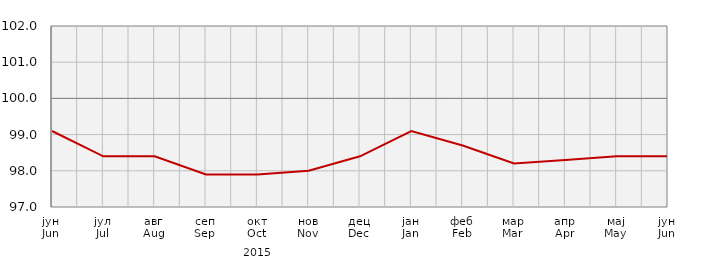
| Category | Индекси потрошачких цијена
Consumer price indices |
|---|---|
| јун
Jun | 99.1 |
| јул
Jul | 98.4 |
| авг
Aug | 98.4 |
| сеп
Sep | 97.9 |
| окт
Oct | 97.9 |
| нов
Nov | 98 |
| дец
Dec | 98.4 |
| јан
Jan | 99.1 |
| феб
Feb | 98.7 |
| мар
Mar | 98.2 |
| апр
Apr | 98.3 |
| мај
May | 98.4 |
| јун
Jun | 98.4 |